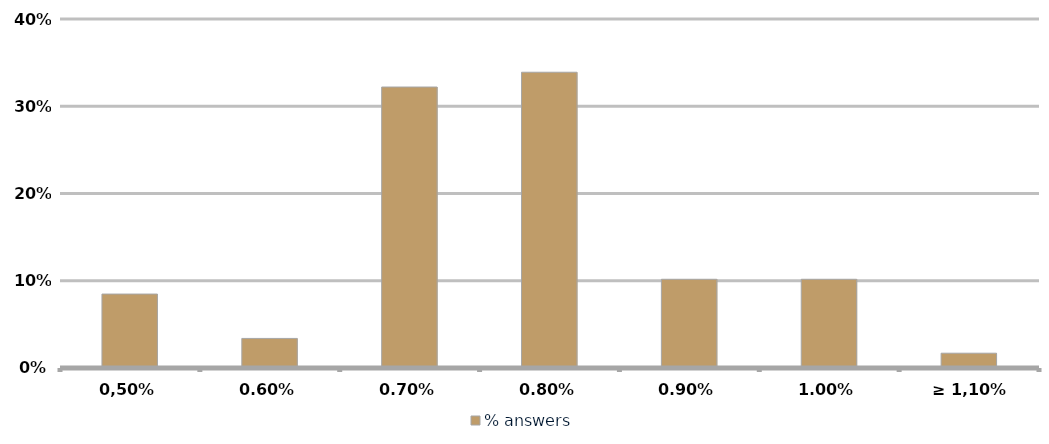
| Category | % answers |
|---|---|
| 0,50% | 0.085 |
| 0.60% | 0.034 |
| 0.70% | 0.322 |
| 0.80% | 0.339 |
| 0.90% | 0.102 |
| 1.00% | 0.102 |
| ≥ 1,10% | 0.017 |